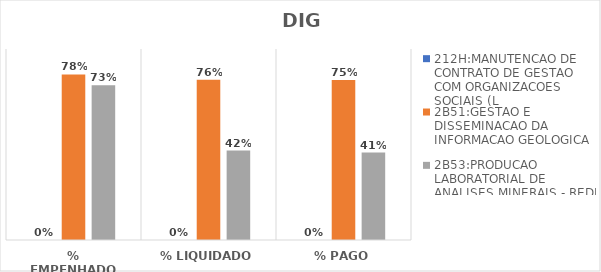
| Category | 212H:MANUTENCAO DE CONTRATO DE GESTAO COM ORGANIZACOES SOCIAIS (L | 2B51:GESTAO E DISSEMINACAO DA INFORMACAO GEOLOGICA | 2B53:PRODUCAO LABORATORIAL DE ANALISES MINERAIS - REDE LAMIN |
|---|---|---|---|
| % EMPENHADO | 0 | 0.78 | 0.73 |
| % LIQUIDADO | 0 | 0.755 | 0.421 |
| % PAGO | 0 | 0.753 | 0.412 |